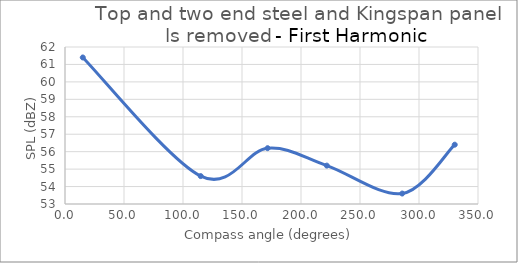
| Category | Series 0 |
|---|---|
| 15.06445125542554 | 61.4 |
| 115.00449447818254 | 54.6 |
| 171.7068171198818 | 56.2 |
| 221.8691292075067 | 55.2 |
| 285.7828166838848 | 53.6 |
| 330.28010595813004 | 56.4 |